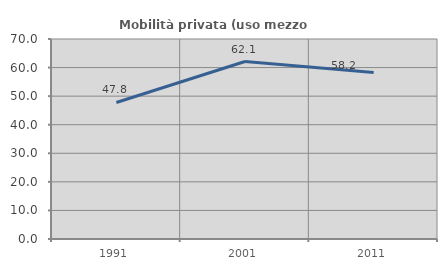
| Category | Mobilità privata (uso mezzo privato) |
|---|---|
| 1991.0 | 47.79 |
| 2001.0 | 62.112 |
| 2011.0 | 58.249 |